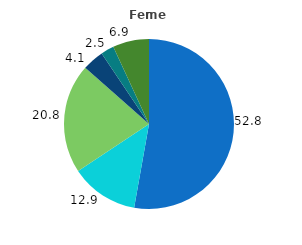
| Category | Series 0 |
|---|---|
| 0 | 52.8 |
| 1 | 12.9 |
| 2 | 20.8 |
| 3 | 4.1 |
| 4 | 2.5 |
| 5 | 6.9 |